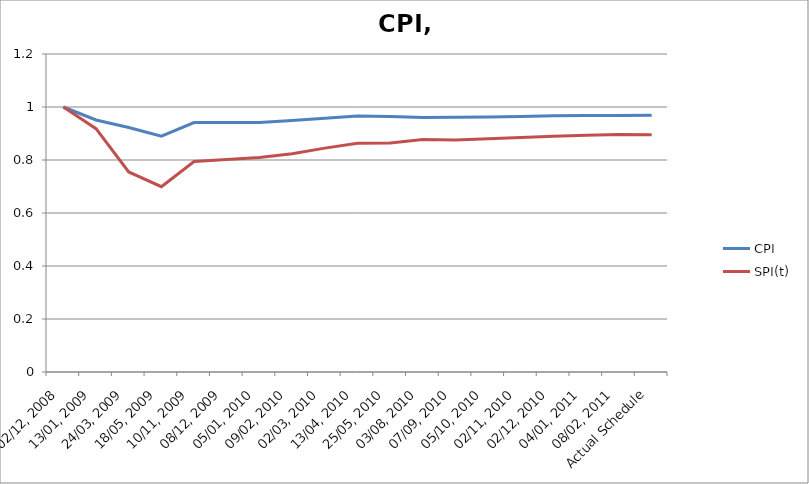
| Category | CPI | SPI(t) |
|---|---|---|
| 02/12, 2008 | 1 | 1 |
| 13/01, 2009 | 0.951 | 0.918 |
| 24/03, 2009 | 0.923 | 0.755 |
| 18/05, 2009 | 0.89 | 0.699 |
| 10/11, 2009 | 0.941 | 0.794 |
| 08/12, 2009 | 0.941 | 0.802 |
| 05/01, 2010 | 0.941 | 0.81 |
| 09/02, 2010 | 0.949 | 0.824 |
| 02/03, 2010 | 0.958 | 0.845 |
| 13/04, 2010 | 0.966 | 0.863 |
| 25/05, 2010 | 0.964 | 0.864 |
| 03/08, 2010 | 0.961 | 0.877 |
| 07/09, 2010 | 0.961 | 0.876 |
| 05/10, 2010 | 0.962 | 0.88 |
| 02/11, 2010 | 0.964 | 0.885 |
| 02/12, 2010 | 0.967 | 0.889 |
| 04/01, 2011 | 0.968 | 0.893 |
| 08/02, 2011 | 0.968 | 0.896 |
| Actual Schedule | 0.969 | 0.895 |